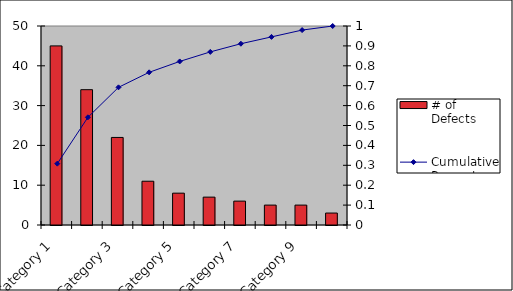
| Category | # of Defects  |
|---|---|
| Category 1 | 45 |
| Category 2 | 34 |
| Category 3 | 22 |
| Category 4 | 11 |
| Category 5 | 8 |
| Category 6 | 7 |
| Category 7 | 6 |
| Category 8 | 5 |
| Category 9 | 5 |
| All Others | 3 |